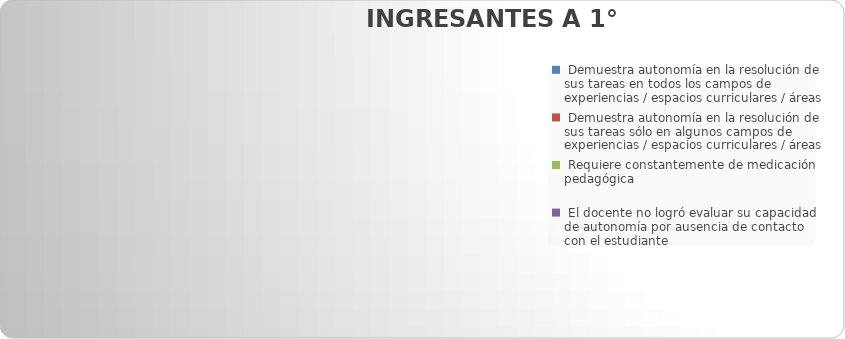
| Category |  Demuestra autonomía en la resolución de sus tareas en todos los campos de experiencias / espacios curriculares / áreas |
|---|---|
|  Demuestra autonomía en la resolución de sus tareas en todos los campos de experiencias / espacios curriculares / áreas | 0 |
|  Demuestra autonomía en la resolución de sus tareas sólo en algunos campos de experiencias / espacios curriculares / áreas  | 0 |
|  Requiere constantemente de medicación pedagógica | 0 |
|  El docente no logró evaluar su capacidad de autonomía por ausencia de contacto con el estudiante | 0 |